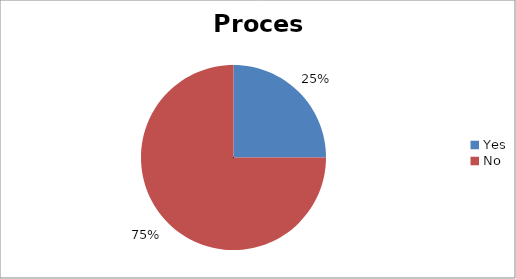
| Category | Process |
|---|---|
| Yes | 1 |
| No | 3 |